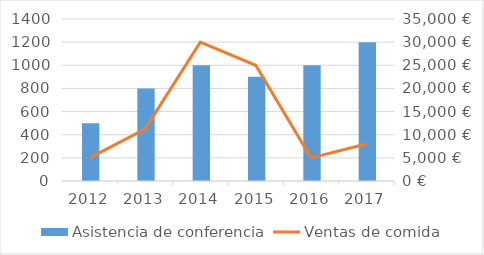
| Category | Asistencia de conferencia |
|---|---|
| 2012-01-15 | 500 |
| 2013-01-15 | 800 |
| 2014-01-15 | 1000 |
| 2015-01-15 | 900 |
| 2016-01-15 | 1000 |
| 2017-01-15 | 1200 |